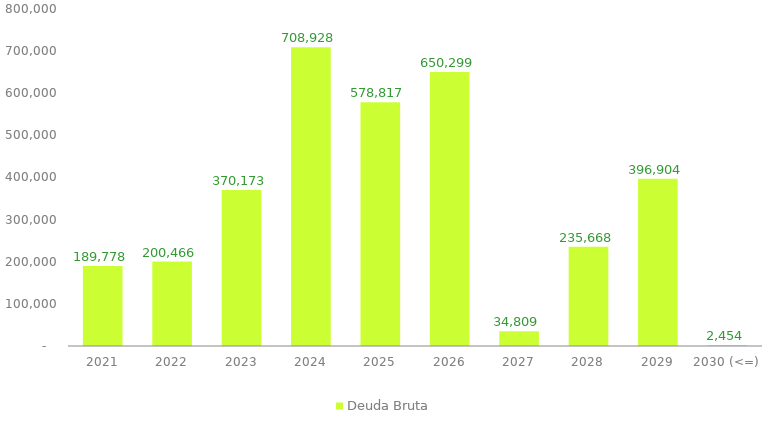
| Category | Deuda Bruta |
|---|---|
| 2021 | 189778.365 |
| 2022 | 200466.021 |
| 2023 | 370172.688 |
| 2024 | 708928.429 |
| 2025 | 578816.622 |
| 2026 | 650299.485 |
| 2027 | 34808.787 |
| 2028 | 235668.115 |
| 2029 | 396904.18 |
| 2030 (<=) | 2453.83 |